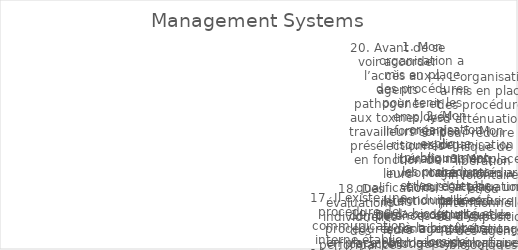
| Category | Series 0 |
|---|---|
| 1. Mon organisation a mis en place des procédures pour tenir les employés informés des risques de libération involontaire et/ou intentionnelle ou d’exposition à des agents biologiques et/ou à des toxines qui sont stockés ou manipulés dans nos installation | 4 |
| 2. Mon organisation explique publiquement les procédures et les règles de conduite liées à la biosécurité et à la biosûreté lors de l’orientation des nouveaux employés. | 0 |
| 3. Mon organisation a mis en place un processus d’analyse des risques-avantages systématique pour la recherche à double usage. | 2 |
| 4. L’organisation a mis en place des procédures d’atténuation pour réduire le risque de libération involontaire et/ou intentionnelle ou d’exposition à des agents biologiques et/ou des toxines stockés ou manipulés dans mon installation. | 1 |
| 5. Mon organisation a mis en place des procédures d’atténuation pour réduire le risque de libération involontaire et/ou intentionnelle ou d’exposition à des agents biologiques et/ou à des toxines stockés ou manipulés dans nos installations. | 1 |
| 6. Mon organisation a mis en place des procédures qui détaillent les actions requises lors d’un incident. | 2 |
| 7. Les leçons tirées des exercices d’urgence ont amélioré les performances organisationnelles. | 0 |
| 8. Mon organisation organise régulièrement des exercices d’intervention d’urgence. | 0 |
| 9. Il existe une liste à jour du personnel ayant un accès autorisé aux agents biologiques. | 1 |
| 10. L’utilisation des enseignements tirés des exercices d’urgence a amélioré les performances organisationnelles. | 1 |
| 11. Il existe une procédure permettant aux employés de signaler un comportement inhabituel à l’égard d’un collègue. | 5 |
| 12. L’utilisation des enseignements tirés des violations de la biosécurité/biosûreté ou des quasi-accidents a amélioré les performances organisationnelles. | 4 |
| 13. Il existe une liste disponible et à jour du personnel autorisé à accéder aux agents biologiques. | 2 |
| 14.  L’organisation a une formation continue en matière de biosécurité et de biosûreté et une formation axée sur les compétences pour les employés. | 2 |
| 15. Les informations concernant les mesures, procédures et politiques de biosécurité et de biosûreté sont facilement accessibles aux employés. | 5 |
| 16. Il existe une procédure permettant aux employés de signaler le comportement inhabituel d’un collègue. | 4 |
| 17. Il existe une procédure de communication interne établie pour informer les employés des incidents de biosécurité et de biosûreté et des quasi-accidents. | 5 |
| 18. Des évaluations individuelles des performances en matière de biosécurité/biosûreté ont lieu régulièrement. | 2 |
| 19. Des procédures sont en place pour la décontamination et la gestion des déchets. | 0 |
| 20. Avant de se voir accorder l’accès aux agents pathogènes et aux toxines, les travailleurs sont présélectionnés en fonction de leurs qualifications, leurs compétences et leurs caractéristiques personnelles appropriées pour le poste, et ainsi ils sont dé | 5 |